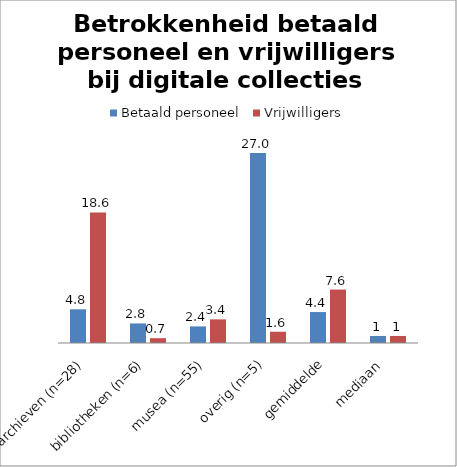
| Category | Betaald personeel | Vrijwilligers |
|---|---|---|
| archieven (n=28) | 4.795 | 18.571 |
| bibliotheken (n=6) | 2.783 | 0.683 |
| musea (n=55) | 2.358 | 3.361 |
| overig (n=5) | 27 | 1.6 |
| gemiddelde | 4.4 | 7.6 |
| mediaan  | 1 | 1 |